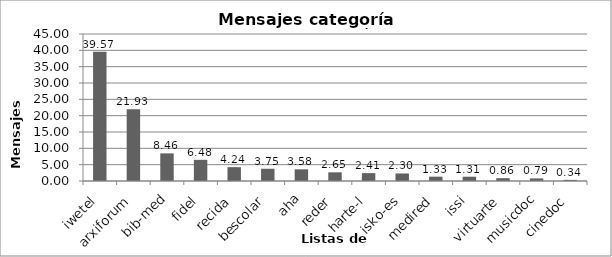
| Category | Porcentaje |
|---|---|
| iwetel | 39.572 |
| arxiforum | 21.93 |
| bib-med | 8.459 |
| fidel | 6.484 |
| recida | 4.241 |
| bescolar | 3.746 |
| aha | 3.576 |
| reder | 2.65 |
| harte-l | 2.412 |
| isko-es | 2.3 |
| medired | 1.331 |
| issi | 1.313 |
| virtuarte | 0.857 |
| musicdoc | 0.791 |
| cinedoc | 0.339 |